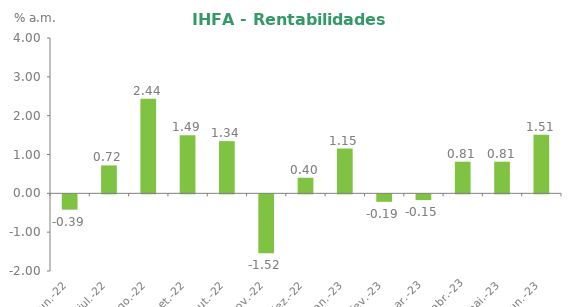
| Category | Series 0 |
|---|---|
| 2022-06-30 | -0.395 |
| 2022-07-29 | 0.719 |
| 2022-08-31 | 2.435 |
| 2022-09-30 | 1.494 |
| 2022-10-31 | 1.344 |
| 2022-11-30 | -1.517 |
| 2022-12-30 | 0.401 |
| 2023-01-31 | 1.154 |
| 2023-02-28 | -0.193 |
| 2023-03-31 | -0.148 |
| 2023-04-28 | 0.815 |
| 2023-05-31 | 0.814 |
| 2023-06-30 | 1.512 |